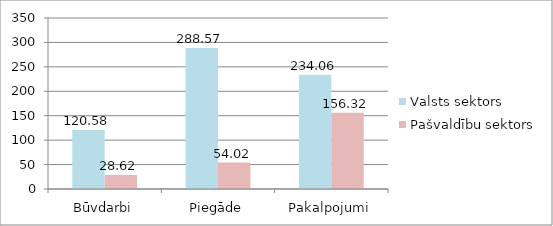
| Category | Valsts sektors | Pašvaldību sektors |
|---|---|---|
| Būvdarbi | 120.58 | 28.62 |
| Piegāde | 288.57 | 54.02 |
| Pakalpojumi | 234.06 | 156.32 |